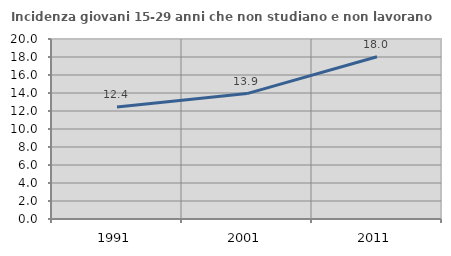
| Category | Incidenza giovani 15-29 anni che non studiano e non lavorano  |
|---|---|
| 1991.0 | 12.445 |
| 2001.0 | 13.934 |
| 2011.0 | 18.023 |